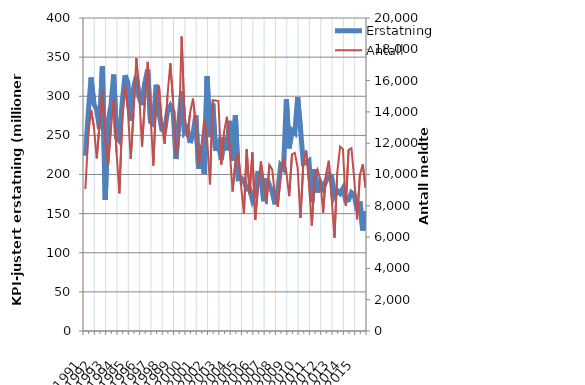
| Category | Erstatning |
|---|---|
| 1991.0 | 224.004 |
| nan | 278.701 |
| nan | 323.912 |
| nan | 290.109 |
| 1992.0 | 282.405 |
| nan | 258.04 |
| nan | 338.16 |
| nan | 167.714 |
| 1993.0 | 267.55 |
| nan | 288.274 |
| nan | 327.744 |
| nan | 247.473 |
| 1994.0 | 243.261 |
| nan | 292.909 |
| nan | 326.717 |
| nan | 316.969 |
| 1995.0 | 268.377 |
| nan | 310.462 |
| nan | 326.029 |
| nan | 298.546 |
| 1996.0 | 288.624 |
| nan | 316.842 |
| nan | 334.294 |
| nan | 267.261 |
| 1997.0 | 264.232 |
| nan | 314.716 |
| nan | 278.564 |
| nan | 257.522 |
| 1998.0 | 255.602 |
| nan | 280.391 |
| nan | 287.517 |
| nan | 279.782 |
| 1999.0 | 219.796 |
| nan | 266.7 |
| nan | 306.511 |
| nan | 254.224 |
| 2000.0 | 259.141 |
| nan | 240.324 |
| nan | 252.088 |
| nan | 275.595 |
| 2001.0 | 207.244 |
| nan | 237.701 |
| nan | 200.728 |
| nan | 325.563 |
| 2002.0 | 247.873 |
| nan | 290.601 |
| nan | 230.457 |
| nan | 239.267 |
| 2003.0 | 218.61 |
| nan | 247.712 |
| nan | 230.981 |
| nan | 268.572 |
| 2004.0 | 217.508 |
| nan | 275.732 |
| nan | 194.81 |
| nan | 195.623 |
| 2005.0 | 192.286 |
| nan | 181.226 |
| nan | 181.978 |
| nan | 167.584 |
| 2006.0 | 176.819 |
| nan | 204.479 |
| nan | 195.021 |
| nan | 165.776 |
| 2007.0 | 195.039 |
| nan | 186.314 |
| nan | 177.691 |
| nan | 161.832 |
| 2008.0 | 179.801 |
| nan | 211.41 |
| nan | 207.185 |
| nan | 295.976 |
| 2009.0 | 233.497 |
| nan | 256.265 |
| nan | 253.058 |
| nan | 298.888 |
| 2010.0 | 258.589 |
| nan | 214.112 |
| nan | 214.991 |
| nan | 217.554 |
| 2011.0 | 164.553 |
| nan | 206.709 |
| nan | 176.997 |
| nan | 189.985 |
| 2012.0 | 182.676 |
| nan | 191.481 |
| nan | 200.115 |
| nan | 197.486 |
| 2013.0 | 172.77 |
| nan | 179.578 |
| nan | 175.887 |
| nan | 182.23 |
| 2014.0 | 166.5 |
| nan | 167.566 |
| nan | 176.903 |
| nan | 174.149 |
| 2015.0 | 153.686 |
| nan | 165.587 |
| nan | 128.534 |
| nan | 153.187 |